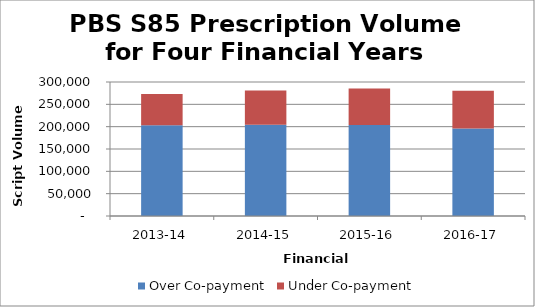
| Category | Over Co‐payment | Under Co‐payment |
|---|---|---|
| 2013-14 | 203061113 | 70337935 |
| 2014-15 | 204429685 | 76738912 |
| 2015-16 | 203934384 | 81410187 |
| 2016-17 | 195810643 | 84841518 |